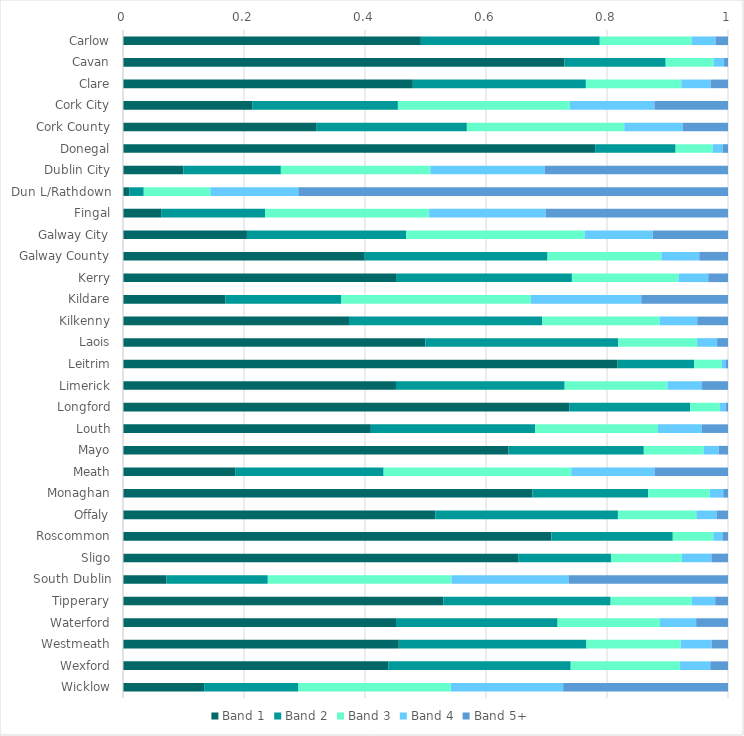
| Category | Band 1 | Band 2 | Band 3 | Band 4 | Band 5+ |
|---|---|---|---|---|---|
| Carlow | 0.492 | 0.296 | 0.152 | 0.04 | 0.021 |
| Cavan | 0.73 | 0.167 | 0.079 | 0.017 | 0.006 |
| Clare | 0.479 | 0.286 | 0.158 | 0.048 | 0.029 |
| Cork City | 0.214 | 0.241 | 0.284 | 0.14 | 0.122 |
| Cork County | 0.32 | 0.248 | 0.26 | 0.097 | 0.075 |
| Donegal | 0.78 | 0.133 | 0.061 | 0.017 | 0.008 |
| Dublin City | 0.1 | 0.161 | 0.247 | 0.189 | 0.303 |
| Dun L/Rathdown | 0.01 | 0.024 | 0.11 | 0.145 | 0.71 |
| Fingal | 0.063 | 0.172 | 0.271 | 0.193 | 0.301 |
| Galway City | 0.205 | 0.263 | 0.295 | 0.113 | 0.124 |
| Galway County | 0.4 | 0.302 | 0.188 | 0.063 | 0.048 |
| Kerry | 0.451 | 0.291 | 0.176 | 0.049 | 0.033 |
| Kildare | 0.169 | 0.192 | 0.313 | 0.183 | 0.143 |
| Kilkenny | 0.374 | 0.319 | 0.194 | 0.062 | 0.051 |
| Laois | 0.5 | 0.319 | 0.13 | 0.033 | 0.018 |
| Leitrim | 0.818 | 0.127 | 0.046 | 0.007 | 0.003 |
| Limerick | 0.451 | 0.279 | 0.17 | 0.057 | 0.043 |
| Longford | 0.738 | 0.2 | 0.049 | 0.01 | 0.004 |
| Louth | 0.41 | 0.272 | 0.203 | 0.073 | 0.043 |
| Mayo | 0.637 | 0.224 | 0.099 | 0.025 | 0.016 |
| Meath | 0.186 | 0.245 | 0.31 | 0.138 | 0.121 |
| Monaghan | 0.677 | 0.191 | 0.102 | 0.022 | 0.008 |
| Offaly | 0.516 | 0.302 | 0.13 | 0.033 | 0.019 |
| Roscommon | 0.708 | 0.201 | 0.067 | 0.015 | 0.009 |
| Sligo | 0.653 | 0.153 | 0.117 | 0.049 | 0.027 |
| South Dublin | 0.071 | 0.168 | 0.304 | 0.193 | 0.264 |
| Tipperary | 0.53 | 0.276 | 0.134 | 0.039 | 0.021 |
| Waterford | 0.451 | 0.267 | 0.169 | 0.06 | 0.053 |
| Westmeath | 0.456 | 0.31 | 0.156 | 0.051 | 0.027 |
| Wexford | 0.438 | 0.302 | 0.181 | 0.05 | 0.029 |
| Wicklow | 0.134 | 0.156 | 0.252 | 0.186 | 0.272 |